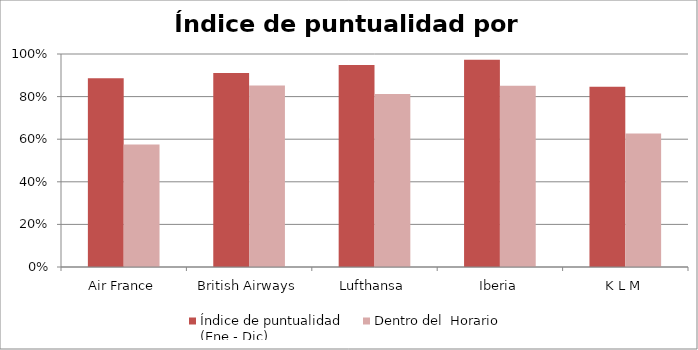
| Category | Índice de puntualidad
(Ene - Dic) | Dentro del  Horario |
|---|---|---|
| Air France | 0.886 | 0.575 |
| British Airways | 0.911 | 0.852 |
| Lufthansa | 0.949 | 0.812 |
| Iberia | 0.973 | 0.851 |
| K L M | 0.846 | 0.627 |